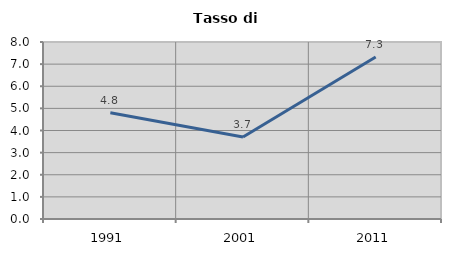
| Category | Tasso di disoccupazione   |
|---|---|
| 1991.0 | 4.8 |
| 2001.0 | 3.707 |
| 2011.0 | 7.319 |